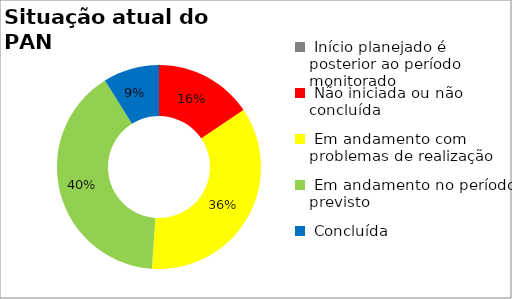
| Category | Series 0 |
|---|---|
|  Início planejado é posterior ao período monitorado | 0 |
|  Não iniciada ou não concluída | 0.156 |
|  Em andamento com problemas de realização | 0.356 |
|  Em andamento no período previsto  | 0.4 |
|  Concluída | 0.089 |